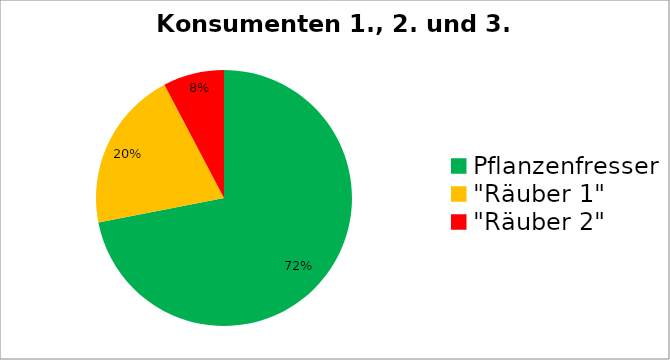
| Category | Series 0 | Series 1 |
|---|---|---|
| Pflanzenfresser | 56 | 56 |
| "Räuber 1" | 15.85 | 15.85 |
| "Räuber 2" | 6 | 6 |